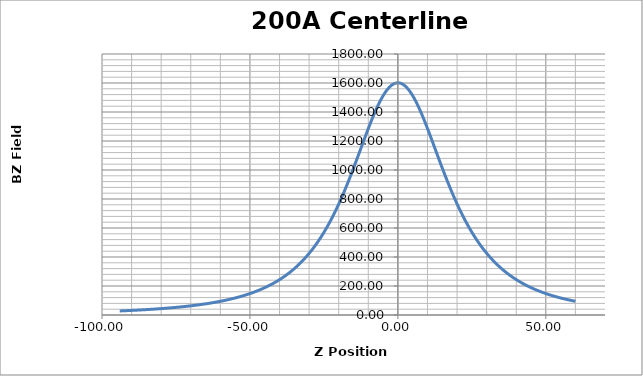
| Category | Series 0 |
|---|---|
| -94.002 | 27.95 |
| -93.801 | 28.14 |
| -93.601 | 28.33 |
| -93.403 | 28.45 |
| -93.202 | 28.61 |
| -93.001 | 28.83 |
| -92.802 | 28.99 |
| -92.605 | 29.15 |
| -92.404 | 29.34 |
| -92.20400000000001 | 29.54 |
| -92.005 | 29.73 |
| -91.807 | 29.9 |
| -91.604 | 30.1 |
| -91.402 | 30.26 |
| -91.203 | 30.5 |
| -91.005 | 30.66 |
| -90.803 | 30.89 |
| -90.602 | 31.06 |
| -90.403 | 31.26 |
| -90.205 | 31.46 |
| -90.005 | 31.66 |
| -89.804 | 31.86 |
| -89.605 | 32.07 |
| -89.407 | 32.27 |
| -89.205 | 32.47 |
| -89.003 | 32.67 |
| -88.803 | 32.89 |
| -88.605 | 33.1 |
| -88.404 | 33.31 |
| -88.202 | 33.52 |
| -88.003 | 33.76 |
| -87.806 | 33.96 |
| -87.604 | 34.22 |
| -87.404 | 34.39 |
| -87.205 | 34.63 |
| -87.007 | 34.83 |
| -86.805 | 35.07 |
| -86.60300000000001 | 35.31 |
| -86.403 | 35.54 |
| -86.205 | 35.78 |
| -86.004 | 36.02 |
| -85.802 | 36.23 |
| -85.60300000000001 | 36.49 |
| -85.406 | 36.7 |
| -85.205 | 36.91 |
| -85.003 | 37.2 |
| -84.805 | 37.44 |
| -84.608 | 37.68 |
| -84.406 | 37.95 |
| -84.20400000000001 | 38.2 |
| -84.005 | 38.45 |
| -83.806 | 38.7 |
| -83.604 | 38.95 |
| -83.403 | 39.21 |
| -83.203 | 39.51 |
| -83.006 | 39.78 |
| -82.804 | 40.06 |
| -82.60300000000001 | 40.32 |
| -82.405 | 40.56 |
| -82.20700000000001 | 40.85 |
| -82.006 | 41.12 |
| -81.804 | 41.39 |
| -81.605 | 41.68 |
| -81.407 | 41.95 |
| -81.206 | 42.29 |
| -81.004 | 42.55 |
| -80.804 | 42.84 |
| -80.607 | 43.13 |
| -80.405 | 43.42 |
| -80.203 | 43.75 |
| -80.005 | 44.04 |
| -79.808 | 44.31 |
| -79.607 | 44.65 |
| -79.406 | 44.94 |
| -79.20700000000001 | 45.24 |
| -79.00800000000001 | 45.59 |
| -78.806 | 45.92 |
| -78.604 | 46.25 |
| -78.404 | 46.55 |
| -78.208 | 46.89 |
| -78.007 | 47.18 |
| -77.805 | 47.53 |
| -77.605 | 47.9 |
| -77.408 | 48.2 |
| -77.207 | 48.58 |
| -77.007 | 48.9 |
| -76.808 | 49.24 |
| -76.60900000000001 | 49.58 |
| -76.40700000000001 | 49.97 |
| -76.205 | 50.31 |
| -76.005 | 50.71 |
| -75.807 | 51.04 |
| -75.606 | 51.43 |
| -75.404 | 51.81 |
| -75.205 | 52.19 |
| -75.007 | 52.55 |
| -74.806 | 52.9 |
| -74.605 | 53.31 |
| -74.406 | 53.69 |
| -74.208 | 54.09 |
| -74.007 | 54.46 |
| -73.805 | 54.89 |
| -73.605 | 55.29 |
| -73.40700000000001 | 55.7 |
| -73.206 | 56.12 |
| -73.004 | 56.56 |
| -72.804 | 56.97 |
| -72.607 | 57.38 |
| -72.406 | 57.82 |
| -72.205 | 58.19 |
| -72.006 | 58.67 |
| -71.81 | 59.11 |
| -71.608 | 59.54 |
| -71.405 | 59.99 |
| -71.20400000000001 | 60.47 |
| -71.007 | 60.91 |
| -70.806 | 61.36 |
| -70.605 | 61.88 |
| -70.404 | 62.33 |
| -70.207 | 62.79 |
| -70.006 | 63.27 |
| -69.804 | 63.75 |
| -69.606 | 64.23 |
| -69.408 | 64.71 |
| -69.207 | 65.21 |
| -69.006 | 65.71 |
| -68.806 | 66.24 |
| -68.608 | 66.72 |
| -68.406 | 67.26 |
| -68.20400000000001 | 67.78 |
| -68.004 | 68.33 |
| -67.806 | 68.8 |
| -67.605 | 69.36 |
| -67.404 | 69.93 |
| -67.20400000000001 | 70.51 |
| -67.009 | 71.04 |
| -66.808 | 71.59 |
| -66.607 | 72.13 |
| -66.406 | 72.72 |
| -66.208 | 73.28 |
| -66.006 | 73.85 |
| -65.804 | 74.47 |
| -65.604 | 75.03 |
| -65.40700000000001 | 75.62 |
| -65.207 | 76.27 |
| -65.005 | 76.9 |
| -64.805 | 77.48 |
| -64.608 | 78.13 |
| -64.408 | 78.75 |
| -64.206 | 79.4 |
| -64.007 | 80.01 |
| -63.809 | 80.67 |
| -63.608000000000004 | 81.33 |
| -63.406000000000006 | 82.01 |
| -63.205 | 82.69 |
| -63.008 | 83.34 |
| -62.806 | 84.05 |
| -62.605000000000004 | 84.75 |
| -62.405 | 85.44 |
| -62.208 | 86.16 |
| -62.008 | 86.84 |
| -61.807 | 87.57 |
| -61.608000000000004 | 88.31 |
| -61.409 | 89.04 |
| -61.208000000000006 | 89.76 |
| -61.005 | 90.56 |
| -60.804 | 91.31 |
| -60.607 | 92.08 |
| -60.406 | 92.83 |
| -60.205000000000005 | 93.62 |
| -60.005 | 94.43 |
| -59.808 | 95.21 |
| -59.607 | 96.01 |
| -59.407000000000004 | 96.83 |
| -59.207 | 97.69 |
| -59.011 | 98.49 |
| -58.81 | 99.32 |
| -58.607 | 100.19 |
| -58.407000000000004 | 101.11 |
| -58.207 | 101.96 |
| -58.007000000000005 | 102.82 |
| -57.804 | 103.75 |
| -57.604 | 104.67 |
| -57.407000000000004 | 105.59 |
| -57.208000000000006 | 106.47 |
| -57.007000000000005 | 107.43 |
| -56.808 | 108.36 |
| -56.61 | 109.33 |
| -56.410000000000004 | 110.31 |
| -56.208000000000006 | 111.3 |
| -56.007000000000005 | 112.27 |
| -55.809000000000005 | 113.26 |
| -55.608000000000004 | 114.27 |
| -55.407000000000004 | 115.28 |
| -55.206 | 116.34 |
| -55.008 | 117.36 |
| -54.808 | 118.41 |
| -54.607 | 119.49 |
| -54.407000000000004 | 120.54 |
| -54.211000000000006 | 121.64 |
| -54.012 | 122.73 |
| -53.809000000000005 | 123.85 |
| -53.608000000000004 | 124.97 |
| -53.409 | 126.11 |
| -53.208000000000006 | 127.28 |
| -53.005 | 128.45 |
| -52.805 | 129.67 |
| -52.608000000000004 | 130.81 |
| -52.408 | 132.04 |
| -52.208000000000006 | 133.24 |
| -52.006 | 134.51 |
| -51.809000000000005 | 135.72 |
| -51.61 | 137.01 |
| -51.408 | 138.27 |
| -51.207 | 139.58 |
| -51.010000000000005 | 140.9 |
| -50.809000000000005 | 142.23 |
| -50.607 | 143.56 |
| -50.405 | 144.95 |
| -50.207 | 146.32 |
| -50.007000000000005 | 147.66 |
| -49.806000000000004 | 149.11 |
| -49.605000000000004 | 150.54 |
| -49.409 | 151.95 |
| -49.21 | 153.4 |
| -49.009 | 154.84 |
| -48.808 | 156.36 |
| -48.609 | 157.88 |
| -48.408 | 159.39 |
| -48.206 | 160.96 |
| -48.005 | 162.53 |
| -47.808 | 164.11 |
| -47.608000000000004 | 165.74 |
| -47.407000000000004 | 167.35 |
| -47.205000000000005 | 168.99 |
| -47.008 | 170.64 |
| -46.808 | 172.29 |
| -46.608000000000004 | 173.98 |
| -46.408 | 175.73 |
| -46.21 | 177.44 |
| -46.010000000000005 | 179.22 |
| -45.807 | 181.03 |
| -45.606 | 182.81 |
| -45.407000000000004 | 184.68 |
| -45.207 | 186.5 |
| -45.005 | 188.39 |
| -44.806000000000004 | 190.27 |
| -44.608000000000004 | 192.16 |
| -44.409 | 194.15 |
| -44.208000000000006 | 196.09 |
| -44.007000000000005 | 198.1 |
| -43.809000000000005 | 200.11 |
| -43.608000000000004 | 202.17 |
| -43.407000000000004 | 204.25 |
| -43.206 | 206.33 |
| -43.008 | 208.44 |
| -42.809000000000005 | 210.58 |
| -42.607 | 212.79 |
| -42.405 | 215.01 |
| -42.207 | 217.2 |
| -42.007000000000005 | 219.47 |
| -41.806000000000004 | 221.76 |
| -41.606 | 224.06 |
| -41.408 | 226.4 |
| -41.209 | 228.75 |
| -41.008 | 231.18 |
| -40.807 | 233.6 |
| -40.609 | 236.06 |
| -40.408 | 238.59 |
| -40.205000000000005 | 241.15 |
| -40.004000000000005 | 243.69 |
| -39.807 | 246.28 |
| -39.608000000000004 | 248.86 |
| -39.407000000000004 | 251.54 |
| -39.207 | 254.23 |
| -39.010000000000005 | 256.94 |
| -38.809000000000005 | 259.69 |
| -38.607 | 262.53 |
| -38.406 | 265.37 |
| -38.208000000000006 | 268.23 |
| -38.008 | 271.15 |
| -37.807 | 274.13 |
| -37.605000000000004 | 277.14 |
| -37.407000000000004 | 280.14 |
| -37.207 | 283.14 |
| -37.005 | 286.27 |
| -36.805 | 289.44 |
| -36.609 | 292.59 |
| -36.410000000000004 | 295.78 |
| -36.208000000000006 | 299.08 |
| -36.006 | 302.4 |
| -35.807 | 305.79 |
| -35.608000000000004 | 309.14 |
| -35.406 | 312.62 |
| -35.204 | 316.13 |
| -35.008 | 319.61 |
| -34.808 | 323.18 |
| -34.607 | 326.85 |
| -34.405 | 330.56 |
| -34.207 | 334.24 |
| -34.008 | 337.97 |
| -33.807 | 341.87 |
| -33.607 | 345.75 |
| -33.410000000000004 | 349.57 |
| -33.21 | 353.57 |
| -33.007000000000005 | 357.65 |
| -32.806000000000004 | 361.75 |
| -32.608000000000004 | 365.8 |
| -32.409 | 369.98 |
| -32.207 | 374.25 |
| -32.006 | 378.54 |
| -31.808 | 382.88 |
| -31.609 | 387.24 |
| -31.409 | 391.75 |
| -31.208000000000006 | 396.3 |
| -31.011000000000003 | 400.82 |
| -30.811 | 405.44 |
| -30.609 | 410.22 |
| -30.407000000000004 | 415.01 |
| -30.209000000000003 | 419.8 |
| -30.010000000000005 | 424.66 |
| -29.808000000000007 | 429.65 |
| -29.607 | 434.7 |
| -29.409000000000006 | 439.76 |
| -29.210000000000008 | 444.87 |
| -29.009 | 450.11 |
| -28.808000000000007 | 455.38 |
| -28.61 | 460.7 |
| -28.411 | 466.08 |
| -28.209000000000003 | 471.62 |
| -28.007999999999996 | 477.24 |
| -27.808999999999997 | 482.79 |
| -27.61 | 488.5 |
| -27.409000000000006 | 494.31 |
| -27.207000000000008 | 500.2 |
| -27.009 | 506.1 |
| -26.810000000000002 | 512 |
| -26.60900000000001 | 518.12 |
| -26.408 | 524.26 |
| -26.211 | 530.42 |
| -26.010999999999996 | 536.73 |
| -25.810000000000002 | 543.13 |
| -25.608000000000004 | 549.64 |
| -25.409999999999997 | 556.11 |
| -25.210000000000008 | 562.71 |
| -25.007999999999996 | 569.48 |
| -24.807000000000002 | 576.31 |
| -24.607 | 583.13 |
| -24.409000000000006 | 589.99 |
| -24.208 | 597.05 |
| -24.007000000000005 | 604.17 |
| -23.808999999999997 | 611.34 |
| -23.611000000000004 | 618.51 |
| -23.409999999999997 | 625.9 |
| -23.208 | 633.43 |
| -23.009 | 640.94 |
| -22.810000000000002 | 648.5 |
| -22.608000000000004 | 656.32 |
| -22.406999999999996 | 664.15 |
| -22.208 | 672.03 |
| -22.009 | 679.95 |
| -21.808000000000007 | 688.04 |
| -21.607 | 696.25 |
| -21.409000000000006 | 704.41 |
| -21.211 | 712.63 |
| -21.010000000000005 | 721.12 |
| -20.808000000000007 | 729.68 |
| -20.60900000000001 | 738.22 |
| -20.409999999999997 | 746.87 |
| -20.209000000000003 | 755.7 |
| -20.007000000000005 | 764.61 |
| -19.808000000000007 | 773.54 |
| -19.60900000000001 | 782.49 |
| -19.408 | 791.7 |
| -19.206000000000003 | 800.93 |
| -19.007000000000005 | 810.19 |
| -18.810000000000002 | 819.41 |
| -18.60900000000001 | 828.9 |
| -18.408 | 838.49 |
| -18.209000000000003 | 848.12 |
| -18.010000000000005 | 857.69 |
| -17.808000000000007 | 867.57 |
| -17.607 | 877.49 |
| -17.408 | 887.42 |
| -17.209000000000003 | 897.31 |
| -17.007000000000005 | 907.48 |
| -16.805999999999997 | 917.72 |
| -16.607 | 927.88 |
| -16.409000000000006 | 938.09 |
| -16.209000000000003 | 948.47 |
| -16.007999999999996 | 958.96 |
| -15.808999999999997 | 969.4 |
| -15.61 | 979.86 |
| -15.408000000000001 | 990.56 |
| -15.207000000000008 | 1001.29 |
| -15.007999999999996 | 1011.97 |
| -14.810000000000002 | 1022.55 |
| -14.608000000000004 | 1033.49 |
| -14.406000000000006 | 1044.43 |
| -14.207000000000008 | 1055.3 |
| -14.009 | 1066.11 |
| -13.808000000000007 | 1077.11 |
| -13.607 | 1088.1 |
| -13.408000000000001 | 1099.07 |
| -13.210000000000008 | 1109.96 |
| -13.007999999999996 | 1121.13 |
| -12.807000000000002 | 1132.22 |
| -12.607 | 1143.3 |
| -12.409000000000006 | 1154.2 |
| -12.207999999999998 | 1165.33 |
| -12.006 | 1176.47 |
| -11.805999999999997 | 1187.51 |
| -11.608000000000004 | 1198.37 |
| -11.406999999999996 | 1209.44 |
| -11.206000000000003 | 1220.44 |
| -11.007999999999996 | 1231.27 |
| -10.810000000000002 | 1242.02 |
| -10.608000000000004 | 1252.96 |
| -10.406000000000006 | 1263.83 |
| -10.207000000000008 | 1274.52 |
| -10.009 | 1285.07 |
| -9.808000000000007 | 1295.67 |
| -9.606000000000009 | 1306.26 |
| -9.406000000000006 | 1316.71 |
| -9.207999999999998 | 1326.89 |
| -9.007000000000005 | 1337.21 |
| -8.805999999999997 | 1347.4 |
| -8.607 | 1357.36 |
| -8.409000000000006 | 1367.16 |
| -8.207999999999998 | 1377 |
| -8.007000000000005 | 1386.73 |
| -7.805999999999997 | 1396.23 |
| -7.609000000000009 | 1405.5 |
| -7.4069999999999965 | 1414.82 |
| -7.206000000000003 | 1423.94 |
| -7.006 | 1432.83 |
| -6.808000000000007 | 1441.53 |
| -6.606999999999999 | 1450.14 |
| -6.406000000000006 | 1458.62 |
| -6.207000000000008 | 1466.81 |
| -6.010000000000005 | 1474.68 |
| -5.8089999999999975 | 1482.56 |
| -5.606999999999999 | 1490.21 |
| -5.4069999999999965 | 1497.62 |
| -5.209000000000003 | 1504.72 |
| -5.007999999999996 | 1511.76 |
| -4.805999999999997 | 1518.54 |
| -4.606999999999999 | 1525.05 |
| -4.409000000000006 | 1531.25 |
| -4.207999999999998 | 1537.34 |
| -4.006 | 1543.08 |
| -3.807000000000002 | 1548.63 |
| -3.6099999999999994 | 1553.85 |
| -3.409000000000006 | 1558.88 |
| -3.207000000000008 | 1563.72 |
| -3.007000000000005 | 1568.16 |
| -2.8100000000000023 | 1572.33 |
| -2.608000000000004 | 1576.27 |
| -2.406000000000006 | 1579.95 |
| -2.207000000000008 | 1583.36 |
| -2.0090000000000003 | 1586.42 |
| -1.808000000000007 | 1589.24 |
| -1.6060000000000088 | 1591.79 |
| -1.406000000000006 | 1594.02 |
| -1.2090000000000032 | 1595.96 |
| -1.0079999999999956 | 1597.6 |
| -0.8070000000000022 | 1598.94 |
| -0.6080000000000041 | 1600.01 |
| -0.4099999999999966 | 1600.78 |
| -0.20900000000000318 | 1601.26 |
| -0.007000000000005002 | 1601.42 |
| 0.19299999999999784 | 1601.29 |
| 0.39000000000000057 | 1600.88 |
| 0.590999999999994 | 1600.14 |
| 0.7929999999999922 | 1599.15 |
| 0.992999999999995 | 1597.83 |
| 1.1899999999999977 | 1596.24 |
| 1.3909999999999911 | 1594.31 |
| 1.5919999999999987 | 1592.1 |
| 1.7920000000000016 | 1589.63 |
| 1.9899999999999949 | 1586.9 |
| 2.1910000000000025 | 1583.81 |
| 2.3930000000000007 | 1580.46 |
| 2.5930000000000035 | 1576.86 |
| 2.789999999999992 | 1572.99 |
| 2.9909999999999997 | 1568.8 |
| 3.192999999999998 | 1564.32 |
| 3.3930000000000007 | 1559.64 |
| 3.590999999999994 | 1554.74 |
| 3.7920000000000016 | 1549.46 |
| 3.992999999999995 | 1543.95 |
| 4.192999999999998 | 1538.19 |
| 4.390000000000001 | 1532.25 |
| 4.590999999999994 | 1526.04 |
| 4.792999999999992 | 1519.51 |
| 4.9950000000000045 | 1512.76 |
| 5.191999999999993 | 1505.92 |
| 5.391999999999996 | 1498.78 |
| 5.593999999999994 | 1491.36 |
| 5.795000000000002 | 1483.77 |
| 5.992000000000004 | 1476.14 |
| 6.191999999999993 | 1468.16 |
| 6.393999999999991 | 1459.9 |
| 6.5930000000000035 | 1451.55 |
| 6.790999999999997 | 1443.13 |
| 6.992000000000004 | 1434.35 |
| 7.194000000000003 | 1425.41 |
| 7.393999999999991 | 1416.33 |
| 7.591999999999999 | 1407.18 |
| 7.792000000000002 | 1397.81 |
| 7.994 | 1388.27 |
| 8.194999999999993 | 1378.58 |
| 8.391999999999996 | 1368.94 |
| 8.593000000000004 | 1359 |
| 8.793999999999997 | 1348.93 |
| 8.994 | 1338.79 |
| 9.191000000000003 | 1328.72 |
| 9.391999999999996 | 1318.38 |
| 9.593000000000004 | 1307.92 |
| 9.793999999999997 | 1297.33 |
| 9.992000000000004 | 1286.89 |
| 10.191999999999993 | 1276.26 |
| 10.393999999999991 | 1265.44 |
| 10.593999999999994 | 1254.7 |
| 10.790999999999997 | 1243.99 |
| 10.992000000000004 | 1233.11 |
| 11.192999999999998 | 1222.14 |
| 11.393999999999991 | 1211.18 |
| 11.590999999999994 | 1200.31 |
| 11.792000000000002 | 1189.28 |
| 11.992999999999995 | 1178.21 |
| 12.194000000000003 | 1167.14 |
| 12.391999999999996 | 1156.21 |
| 12.591999999999999 | 1145.13 |
| 12.793999999999997 | 1134.02 |
| 12.994 | 1122.96 |
| 13.191999999999993 | 1112.1 |
| 13.391999999999996 | 1101.06 |
| 13.593999999999994 | 1089.95 |
| 13.795000000000002 | 1078.93 |
| 13.992000000000004 | 1068.12 |
| 14.191999999999993 | 1057.25 |
| 14.393 | 1046.29 |
| 14.593999999999994 | 1035.44 |
| 14.790999999999997 | 1024.79 |
| 14.992000000000004 | 1013.99 |
| 15.194000000000003 | 1003.16 |
| 15.394999999999996 | 992.45 |
| 15.591999999999999 | 982.02 |
| 15.792000000000002 | 971.47 |
| 15.992999999999995 | 960.91 |
| 16.194999999999993 | 950.43 |
| 16.391999999999996 | 940.23 |
| 16.592 | 929.93 |
| 16.792999999999992 | 919.65 |
| 16.992999999999995 | 909.46 |
| 17.191000000000003 | 899.48 |
| 17.39099999999999 | 889.48 |
| 17.593999999999994 | 879.41 |
| 17.793999999999997 | 869.55 |
| 17.992000000000004 | 859.87 |
| 18.191999999999993 | 850.18 |
| 18.39399999999999 | 840.47 |
| 18.593000000000004 | 830.93 |
| 18.790999999999997 | 821.58 |
| 18.991 | 812.21 |
| 19.192999999999998 | 802.84 |
| 19.393 | 793.64 |
| 19.590000000000003 | 784.62 |
| 19.789999999999992 | 775.62 |
| 19.992000000000004 | 766.57 |
| 20.192999999999998 | 757.7 |
| 20.39099999999999 | 748.98 |
| 20.590999999999994 | 740.29 |
| 20.792 | 731.68 |
| 20.992999999999995 | 723.09 |
| 21.189999999999998 | 714.81 |
| 21.39099999999999 | 706.48 |
| 21.592 | 698.18 |
| 21.792999999999992 | 689.97 |
| 21.989999999999995 | 681.96 |
| 22.189999999999998 | 674.06 |
| 22.39099999999999 | 666.11 |
| 22.593000000000004 | 658.25 |
| 22.790999999999997 | 650.57 |
| 22.991 | 642.95 |
| 23.191999999999993 | 635.38 |
| 23.393 | 627.87 |
| 23.590999999999994 | 620.54 |
| 23.790999999999997 | 613.28 |
| 23.992000000000004 | 606.01 |
| 24.192999999999998 | 598.84 |
| 24.39099999999999 | 591.9 |
| 24.590000000000003 | 584.98 |
| 24.792 | 578.03 |
| 24.992999999999995 | 571.24 |
| 25.191000000000003 | 564.57 |
| 25.39099999999999 | 557.95 |
| 25.592 | 551.36 |
| 25.792999999999992 | 544.87 |
| 25.991 | 538.54 |
| 26.191000000000003 | 532.18 |
| 26.393 | 525.92 |
| 26.593000000000004 | 519.75 |
| 26.790999999999997 | 513.71 |
| 26.991 | 507.69 |
| 27.192999999999998 | 501.73 |
| 27.39399999999999 | 495.85 |
| 27.592 | 490.16 |
| 27.790999999999997 | 484.43 |
| 27.992999999999995 | 478.74 |
| 28.192999999999998 | 473.15 |
| 28.39099999999999 | 467.7 |
| 28.590999999999994 | 462.27 |
| 28.792999999999992 | 456.85 |
| 28.992999999999995 | 451.53 |
| 29.191999999999993 | 446.39 |
| 29.391999999999996 | 441.19 |
| 29.593000000000004 | 436.07 |
| 29.793999999999997 | 431.03 |
| 29.992000000000004 | 426.09 |
| 30.191999999999993 | 421.22 |
| 30.393 | 416.31 |
| 30.593000000000004 | 411.54 |
| 30.790999999999997 | 406.87 |
| 30.991 | 402.19 |
| 31.192999999999998 | 397.56 |
| 31.39399999999999 | 393.01 |
| 31.592 | 388.6 |
| 31.792 | 384.14 |
| 31.994 | 379.78 |
| 32.19499999999999 | 375.44 |
| 32.391999999999996 | 371.22 |
| 32.592 | 367.03 |
| 32.794 | 362.83 |
| 32.995000000000005 | 358.71 |
| 33.19199999999999 | 354.73 |
| 33.39099999999999 | 350.77 |
| 33.593 | 346.78 |
| 33.794 | 342.88 |
| 33.99199999999999 | 339.07 |
| 34.191 | 335.31 |
| 34.393 | 331.56 |
| 34.593999999999994 | 327.85 |
| 34.792 | 324.23 |
| 34.99199999999999 | 320.66 |
| 35.19399999999999 | 317.08 |
| 35.39500000000001 | 313.53 |
| 35.59299999999999 | 310.16 |
| 35.792 | 306.74 |
| 35.992999999999995 | 303.33 |
| 36.19399999999999 | 300.02 |
| 36.391999999999996 | 296.77 |
| 36.59100000000001 | 293.54 |
| 36.79400000000001 | 290.3 |
| 36.995000000000005 | 287.14 |
| 37.192999999999984 | 284.06 |
| 37.393 | 280.95 |
| 37.595 | 277.93 |
| 37.79599999999999 | 274.89 |
| 37.994 | 271.97 |
| 38.192999999999984 | 269.05 |
| 38.394000000000005 | 266.17 |
| 38.593999999999994 | 263.28 |
| 38.792 | 260.53 |
| 38.99199999999999 | 257.76 |
| 39.19399999999999 | 254.96 |
| 39.39500000000001 | 252.27 |
| 39.593999999999994 | 249.59 |
| 39.793000000000006 | 246.96 |
| 39.995000000000005 | 244.37 |
| 40.196 | 241.75 |
| 40.39500000000001 | 239.23 |
| 40.59299999999999 | 236.75 |
| 40.79400000000001 | 234.25 |
| 40.995000000000005 | 231.78 |
| 41.19399999999999 | 229.38 |
| 41.391999999999996 | 227.02 |
| 41.593999999999994 | 224.65 |
| 41.79499999999999 | 222.26 |
| 41.994 | 220.01 |
| 42.192999999999984 | 217.78 |
| 42.39500000000001 | 215.52 |
| 42.596000000000004 | 213.3 |
| 42.79499999999999 | 211.12 |
| 42.994 | 208.98 |
| 43.19399999999999 | 206.85 |
| 43.39599999999999 | 204.72 |
| 43.591999999999985 | 202.67 |
| 43.791 | 200.63 |
| 43.992999999999995 | 198.56 |
| 44.19399999999999 | 196.56 |
| 44.39099999999999 | 194.61 |
| 44.59100000000001 | 192.66 |
| 44.793000000000006 | 190.73 |
| 44.994 | 188.78 |
| 45.192999999999984 | 186.92 |
| 45.391999999999996 | 185.07 |
| 45.59299999999999 | 183.22 |
| 45.79499999999999 | 181.4 |
| 45.994 | 179.64 |
| 46.191 | 177.85 |
| 46.393 | 176.1 |
| 46.593999999999994 | 174.34 |
| 46.793000000000006 | 172.66 |
| 46.990999999999985 | 171 |
| 47.192999999999984 | 169.29 |
| 47.394000000000005 | 167.63 |
| 47.59299999999999 | 166.01 |
| 47.792 | 164.43 |
| 47.994 | 162.85 |
| 48.19399999999999 | 161.27 |
| 48.394000000000005 | 159.73 |
| 48.591999999999985 | 158.21 |
| 48.793000000000006 | 156.66 |
| 48.995000000000005 | 155.16 |
| 49.19399999999999 | 153.67 |
| 49.391999999999996 | 152.21 |
| 49.59299999999999 | 150.78 |
| 49.79499999999999 | 149.38 |
| 49.994 | 147.95 |
| 50.19200000000001 | 146.58 |
| 50.393 | 145.21 |
| 50.595 | 143.81 |
| 50.79400000000001 | 142.49 |
| 50.99199999999999 | 141.17 |
| 51.192999999999984 | 139.84 |
| 51.394000000000005 | 138.52 |
| 51.593999999999994 | 137.26 |
| 51.791 | 136.01 |
| 51.992999999999995 | 134.76 |
| 52.19499999999999 | 133.5 |
| 52.39500000000001 | 132.28 |
| 52.59100000000001 | 131.09 |
| 52.793000000000006 | 129.86 |
| 52.995000000000005 | 128.68 |
| 53.19399999999999 | 127.53 |
| 53.391999999999996 | 126.37 |
| 53.59299999999999 | 125.22 |
| 53.79499999999999 | 124.08 |
| 53.995000000000005 | 123 |
| 54.192999999999984 | 121.88 |
| 54.393 | 120.77 |
| 54.596000000000004 | 119.68 |
| 54.79499999999999 | 118.61 |
| 54.990999999999985 | 117.6 |
| 55.192999999999984 | 116.54 |
| 55.39500000000001 | 115.51 |
| 55.595 | 114.46 |
| 55.793000000000006 | 113.47 |
| 55.994 | 112.44 |
| 56.19499999999999 | 111.46 |
| 56.394000000000005 | 110.48 |
| 56.59299999999999 | 109.48 |
| 56.79400000000001 | 108.54 |
| 56.994 | 107.58 |
| 57.19499999999999 | 106.66 |
| 57.393 | 105.72 |
| 57.593999999999994 | 104.85 |
| 57.79599999999999 | 103.94 |
| 57.99600000000001 | 103.02 |
| 58.192999999999984 | 102.16 |
| 58.394000000000005 | 101.27 |
| 58.595 | 100.39 |
| 58.79499999999999 | 99.54 |
| 58.992999999999995 | 98.71 |
| 59.19399999999999 | 97.86 |
| 59.39500000000001 | 97.01 |
| 59.595 | 96.23 |
| 59.793000000000006 | 95.43 |
| 59.992999999999995 | 94.61 |